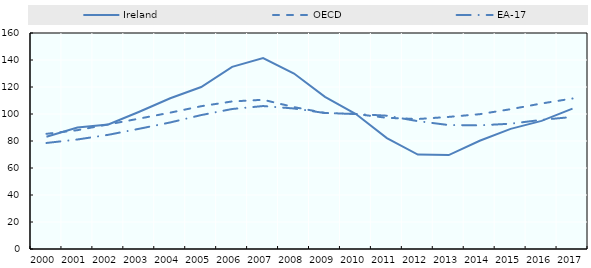
| Category | Ireland | OECD | EA-17 |
|---|---|---|---|
| 2000.0 | 83.113 | 85.312 | 78.542 |
| 2001.0 | 90.019 | 88.023 | 81.117 |
| 2002.0 | 92.187 | 92.302 | 84.593 |
| 2003.0 | 101.682 | 96.608 | 89.076 |
| 2004.0 | 111.633 | 101.013 | 93.743 |
| 2005.0 | 120.003 | 105.761 | 99.199 |
| 2006.0 | 134.953 | 109.304 | 103.697 |
| 2007.0 | 141.485 | 110.542 | 105.893 |
| 2008.0 | 129.98 | 105.092 | 104.08 |
| 2009.0 | 112.659 | 100.781 | 100.706 |
| 2010.0 | 100 | 100 | 100 |
| 2011.0 | 82.154 | 97.167 | 98.737 |
| 2012.0 | 69.923 | 96.274 | 94.698 |
| 2013.0 | 69.564 | 97.849 | 91.817 |
| 2014.0 | 80.153 | 99.854 | 91.591 |
| 2015.0 | 88.998 | 103.575 | 92.807 |
| 2016.0 | 94.88 | 107.796 | 95.652 |
| 2017.0 | 103.959 | 111.467 | 97.827 |